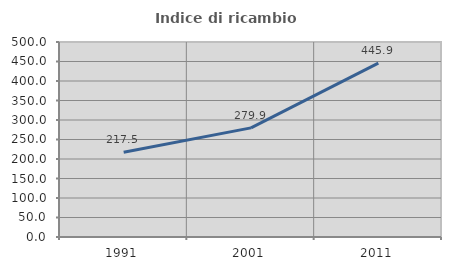
| Category | Indice di ricambio occupazionale  |
|---|---|
| 1991.0 | 217.452 |
| 2001.0 | 279.855 |
| 2011.0 | 445.876 |